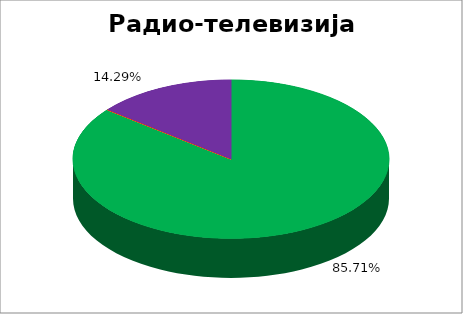
| Category | Радио-телевизија Србије  |
|---|---|
| 0 | 0.857 |
| 1 | 0 |
| 2 | 0 |
| 3 | 0 |
| 4 | 0.143 |